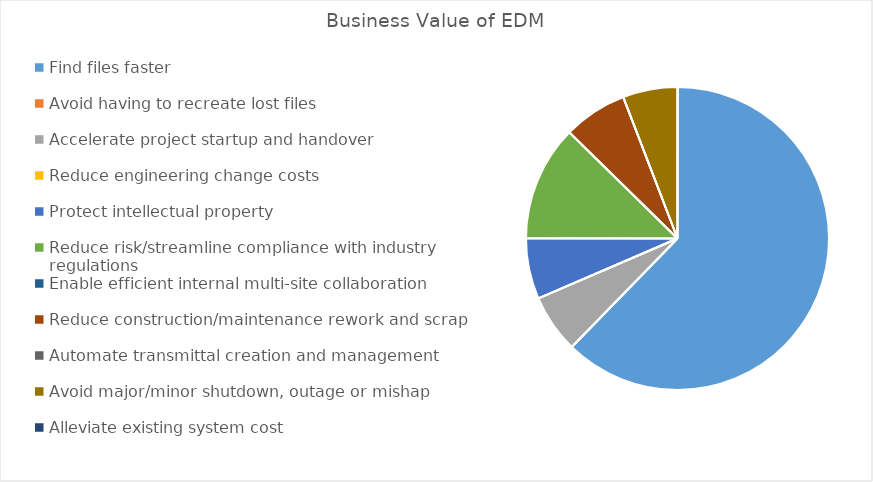
| Category | Series 0 |
|---|---|
| Find files faster | 480000 |
| Avoid having to recreate lost files | 0 |
| Accelerate project startup and handover | 48000 |
| Reduce engineering change costs | 0 |
| Protect intellectual property | 50000 |
| Reduce risk/streamline compliance with industry regulations | 95000 |
| Enable efficient internal multi-site collaboration | 0 |
| Reduce construction/maintenance rework and scrap | 52500 |
| Automate transmittal creation and management | 0 |
| Avoid major/minor shutdown, outage or mishap | 45000 |
| Alleviate existing system cost | 0 |